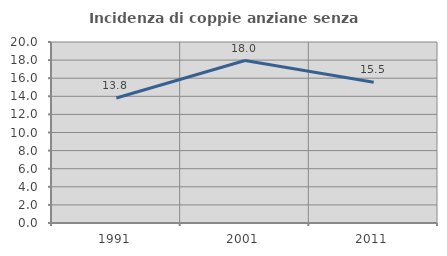
| Category | Incidenza di coppie anziane senza figli  |
|---|---|
| 1991.0 | 13.813 |
| 2001.0 | 17.954 |
| 2011.0 | 15.546 |